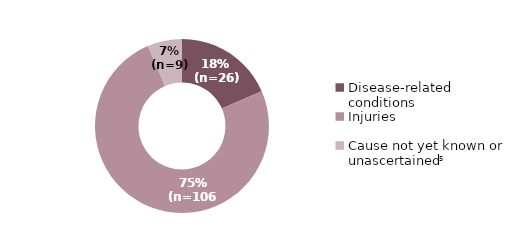
| Category | Series 0 |
|---|---|
| Disease-related conditions | 26 |
| Injuries | 106 |
| Cause not yet known or unascertained | 9 |